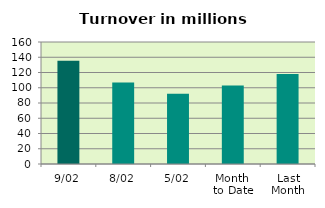
| Category | Series 0 |
|---|---|
| 9/02 | 135.423 |
| 8/02 | 107.001 |
| 5/02 | 92.081 |
| Month 
to Date | 102.855 |
| Last
Month | 118.136 |